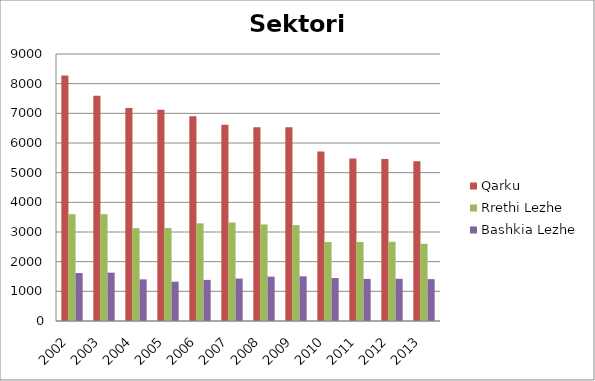
| Category | Qarku | Rrethi Lezhe | Bashkia Lezhe |
|---|---|---|---|
| 2002.0 | 8274 | 3601 | 1618 |
| 2003.0 | 7594 | 3601 | 1630 |
| 2004.0 | 7182 | 3129 | 1403 |
| 2005.0 | 7120 | 3133 | 1325 |
| 2006.0 | 6898 | 3291 | 1386 |
| 2007.0 | 6619 | 3319 | 1430 |
| 2008.0 | 6533 | 3254 | 1496 |
| 2009.0 | 6533 | 3232 | 1506 |
| 2010.0 | 5715 | 2661 | 1448 |
| 2011.0 | 5479 | 2664 | 1418 |
| 2012.0 | 5461 | 2670 | 1423 |
| 2013.0 | 5387 | 2601 | 1411 |